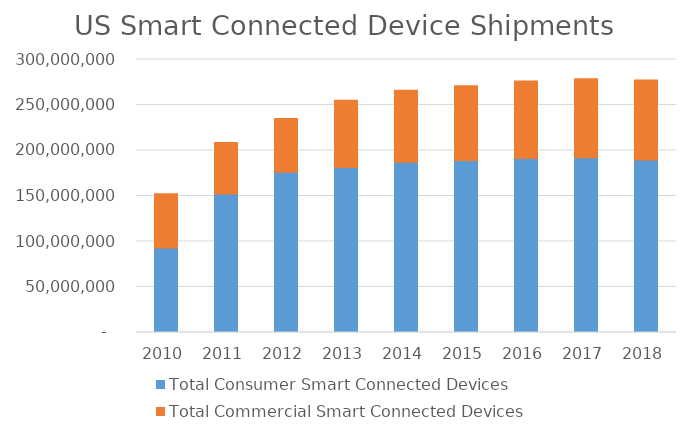
| Category | Total Consumer Smart Connected Devices | Total Commercial Smart Connected Devices |
|---|---|---|
| 2010.0 | 92807698 | 59532289 |
| 2011.0 | 152122956 | 56745416 |
| 2012.0 | 175967748 | 59186905 |
| 2013.0 | 181196313 | 74011154 |
| 2014.0 | 187080518 | 79249443 |
| 2015.0 | 188931387 | 82252030 |
| 2016.0 | 191284566 | 85154383 |
| 2017.0 | 191981711 | 86842922 |
| 2018.0 | 189566905 | 87956997 |